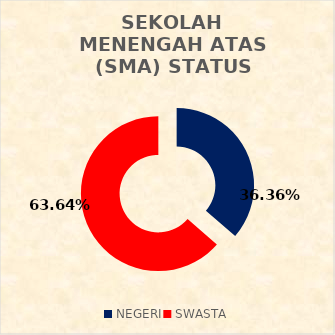
| Category | SEKOLAH MENENGAH ATAS (SMA) STATUS SEKOLAH |
|---|---|
| NEGERI | 12 |
| SWASTA | 21 |